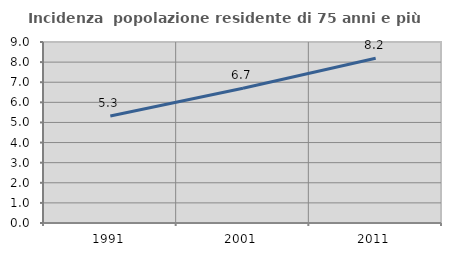
| Category | Incidenza  popolazione residente di 75 anni e più |
|---|---|
| 1991.0 | 5.318 |
| 2001.0 | 6.703 |
| 2011.0 | 8.189 |